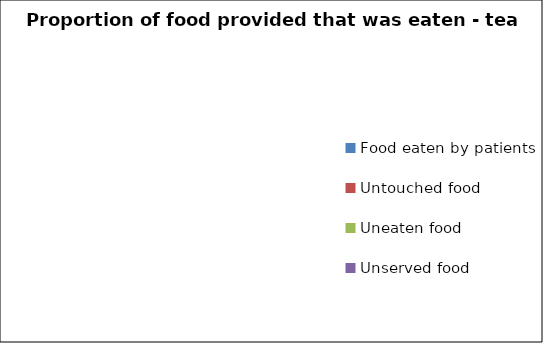
| Category | Proportion of food provided that was eaten - tea |
|---|---|
| Food eaten by patients | 0 |
| Untouched food | 0 |
| Uneaten food | 0 |
| Unserved food | 0 |